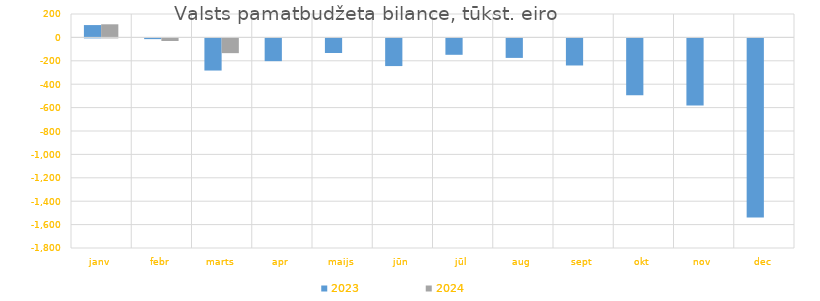
| Category | 2023 | 2024 |
|---|---|---|
| janv | 105353.718 | 111979.605 |
| febr | -6220.179 | -22271.23 |
| marts | -274666.553 | -126079.607 |
| apr | -194503.718 | 0 |
| maijs | -124781.003 | 0 |
| jūn | -236599.834 | 0 |
| jūl | -140162.257 | 0 |
| aug | -166723.666 | 0 |
| sept | -231453.563 | 0 |
| okt | -484910.74 | 0 |
| nov | -572440.257 | 0 |
| dec | -1531000.702 | 0 |